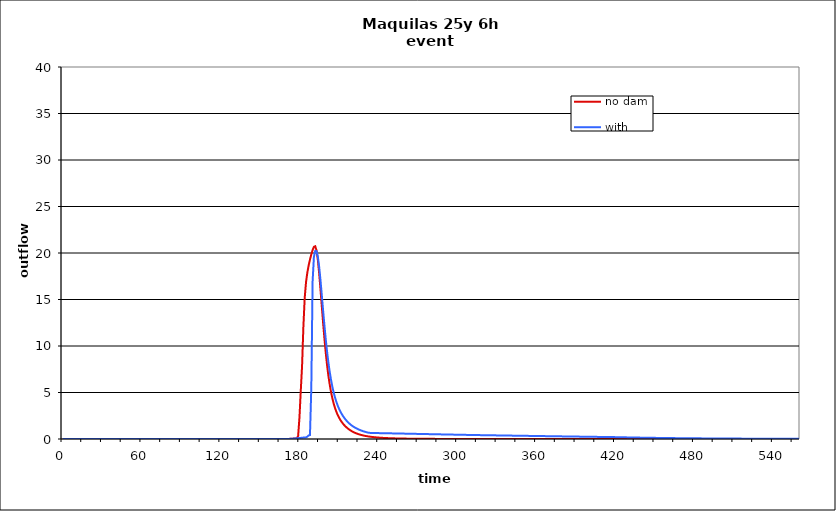
| Category | no dam | with dam |
|---|---|---|
| 0.0 | 0 | 0 |
| 1.0 | 0 | 0 |
| 2.0 | 0 | 0 |
| 3.0 | 0 | 0 |
| 4.0 | 0 | 0 |
| 5.0 | 0 | 0 |
| 6.0 | 0 | 0 |
| 7.0 | 0 | 0 |
| 8.0 | 0 | 0 |
| 9.0 | 0 | 0 |
| 10.0 | 0 | 0 |
| 11.0 | 0 | 0 |
| 12.0 | 0 | 0 |
| 13.0 | 0 | 0 |
| 14.0 | 0 | 0 |
| 15.0 | 0 | 0 |
| 16.0 | 0 | 0 |
| 17.0 | 0 | 0 |
| 18.0 | 0 | 0 |
| 19.0 | 0 | 0 |
| 20.0 | 0 | 0 |
| 21.0 | 0 | 0 |
| 22.0 | 0 | 0 |
| 23.0 | 0 | 0 |
| 24.0 | 0 | 0 |
| 25.0 | 0 | 0 |
| 26.0 | 0 | 0 |
| 27.0 | 0 | 0 |
| 28.0 | 0 | 0 |
| 29.0 | 0 | 0 |
| 30.0 | 0 | 0 |
| 31.0 | 0 | 0 |
| 32.0 | 0 | 0 |
| 33.0 | 0 | 0 |
| 34.0 | 0 | 0 |
| 35.0 | 0 | 0 |
| 36.0 | 0 | 0 |
| 37.0 | 0 | 0 |
| 38.0 | 0 | 0 |
| 39.0 | 0 | 0 |
| 40.0 | 0 | 0 |
| 41.0 | 0 | 0 |
| 42.0 | 0 | 0 |
| 43.0 | 0 | 0 |
| 44.0 | 0 | 0 |
| 45.0 | 0 | 0 |
| 46.0 | 0 | 0 |
| 47.0 | 0 | 0 |
| 48.0 | 0 | 0 |
| 49.0 | 0 | 0 |
| 50.0 | 0 | 0 |
| 51.0 | 0 | 0 |
| 52.0 | 0 | 0 |
| 53.0 | 0 | 0 |
| 54.0 | 0 | 0 |
| 55.0 | 0 | 0 |
| 56.0 | 0 | 0 |
| 57.0 | 0 | 0 |
| 58.0 | 0 | 0 |
| 59.0 | 0 | 0 |
| 60.0 | 0 | 0 |
| 61.0 | 0 | 0 |
| 62.0 | 0 | 0 |
| 63.0 | 0 | 0 |
| 64.0 | 0 | 0 |
| 65.0 | 0 | 0 |
| 66.0 | 0 | 0 |
| 67.0 | 0 | 0 |
| 68.0 | 0 | 0 |
| 69.0 | 0 | 0 |
| 70.0 | 0 | 0 |
| 71.0 | 0 | 0 |
| 72.0 | 0 | 0 |
| 73.0 | 0 | 0 |
| 74.0 | 0 | 0 |
| 75.0 | 0 | 0 |
| 76.0 | 0 | 0 |
| 77.0 | 0 | 0 |
| 78.0 | 0 | 0 |
| 79.0 | 0 | 0 |
| 80.0 | 0 | 0 |
| 81.0 | 0 | 0 |
| 82.0 | 0 | 0 |
| 83.0 | 0 | 0 |
| 84.0 | 0 | 0 |
| 85.0 | 0 | 0 |
| 86.0 | 0 | 0 |
| 87.0 | 0 | 0 |
| 88.0 | 0 | 0 |
| 89.0 | 0 | 0 |
| 90.0 | 0 | 0 |
| 91.0 | 0 | 0 |
| 92.0 | 0 | 0 |
| 93.0 | 0 | 0 |
| 94.0 | 0 | 0 |
| 95.0 | 0 | 0 |
| 96.0 | 0 | 0 |
| 97.0 | 0 | 0 |
| 98.0 | 0 | 0 |
| 99.0 | 0 | 0 |
| 100.0 | 0 | 0 |
| 101.0 | 0 | 0 |
| 102.0 | 0 | 0 |
| 103.0 | 0 | 0 |
| 104.0 | 0 | 0 |
| 105.0 | 0 | 0 |
| 106.0 | 0 | 0 |
| 107.0 | 0 | 0 |
| 108.0 | 0 | 0 |
| 109.0 | 0 | 0 |
| 110.0 | 0 | 0 |
| 111.0 | 0 | 0 |
| 112.0 | 0 | 0 |
| 113.0 | 0 | 0 |
| 114.0 | 0 | 0 |
| 115.0 | 0 | 0 |
| 116.0 | 0 | 0 |
| 117.0 | 0 | 0 |
| 118.0 | 0 | 0 |
| 119.0 | 0 | 0 |
| 120.0 | 0 | 0 |
| 121.0 | 0 | 0 |
| 122.0 | 0 | 0 |
| 123.0 | 0 | 0 |
| 124.0 | 0 | 0 |
| 125.0 | 0 | 0 |
| 126.0 | 0 | 0 |
| 127.0 | 0 | 0 |
| 128.0 | 0 | 0 |
| 129.0 | 0 | 0 |
| 130.0 | 0 | 0 |
| 131.0 | 0 | 0 |
| 132.0 | 0 | 0 |
| 133.0 | 0 | 0 |
| 134.0 | 0 | 0 |
| 135.0 | 0 | 0 |
| 136.0 | 0 | 0 |
| 137.0 | 0 | 0 |
| 138.0 | 0 | 0 |
| 139.0 | 0 | 0 |
| 140.0 | 0 | 0 |
| 141.0 | 0 | 0 |
| 142.0 | 0 | 0 |
| 143.0 | 0 | 0 |
| 144.0 | 0 | 0 |
| 145.0 | 0 | 0 |
| 146.0 | 0 | 0 |
| 147.0 | 0 | 0 |
| 148.0 | 0 | 0 |
| 149.0 | 0 | 0 |
| 150.0 | 0 | 0 |
| 151.0 | 0 | 0 |
| 152.0 | 0 | 0 |
| 153.0 | 0 | 0 |
| 154.0 | 0 | 0 |
| 155.0 | 0 | 0 |
| 156.0 | 0 | 0 |
| 157.0 | 0 | 0 |
| 158.0 | 0 | 0 |
| 159.0 | 0 | 0 |
| 160.0 | 0 | 0 |
| 161.0 | 0 | 0 |
| 162.0 | 0 | 0 |
| 163.0 | 0 | 0 |
| 164.0 | 0 | 0 |
| 165.0 | 0 | 0 |
| 166.0 | 0.001 | 0.001 |
| 167.0 | 0.001 | 0.001 |
| 168.0 | 0.001 | 0.001 |
| 169.0 | 0.001 | 0.001 |
| 170.0 | 0.002 | 0.002 |
| 171.0 | 0.003 | 0.003 |
| 172.0 | 0.009 | 0.009 |
| 173.0 | 0.018 | 0.018 |
| 174.0 | 0.029 | 0.028 |
| 175.0 | 0.04 | 0.039 |
| 176.0 | 0.052 | 0.051 |
| 177.0 | 0.059 | 0.063 |
| 178.0 | 0.091 | 0.077 |
| 179.0 | 0.318 | 0.091 |
| 180.0 | 2.296 | 0.105 |
| 181.0 | 5.169 | 0.121 |
| 182.0 | 7.875 | 0.136 |
| 183.0 | 12.093 | 0.152 |
| 184.0 | 15.18 | 0.164 |
| 185.0 | 16.865 | 0.177 |
| 186.0 | 17.899 | 0.255 |
| 187.0 | 18.661 | 0.38 |
| 188.0 | 19.294 | 0.425 |
| 189.0 | 19.843 | 5.418 |
| 190.0 | 20.314 | 16.945 |
| 191.0 | 20.663 | 19.592 |
| 192.0 | 20.724 | 20.225 |
| 193.0 | 20.264 | 20.198 |
| 194.0 | 19.236 | 19.599 |
| 195.0 | 17.79 | 18.495 |
| 196.0 | 16.079 | 17.058 |
| 197.0 | 14.263 | 15.443 |
| 198.0 | 12.468 | 13.79 |
| 199.0 | 10.779 | 12.192 |
| 200.0 | 9.258 | 10.71 |
| 201.0 | 7.933 | 9.384 |
| 202.0 | 6.802 | 8.224 |
| 203.0 | 5.854 | 7.22 |
| 204.0 | 5.056 | 6.363 |
| 205.0 | 4.382 | 5.634 |
| 206.0 | 3.816 | 5.01 |
| 207.0 | 3.345 | 4.476 |
| 208.0 | 2.949 | 4.017 |
| 209.0 | 2.612 | 3.624 |
| 210.0 | 2.323 | 3.283 |
| 211.0 | 2.073 | 2.986 |
| 212.0 | 1.856 | 2.724 |
| 213.0 | 1.666 | 2.493 |
| 214.0 | 1.497 | 2.287 |
| 215.0 | 1.352 | 2.103 |
| 216.0 | 1.223 | 1.939 |
| 217.0 | 1.106 | 1.791 |
| 218.0 | 1.001 | 1.657 |
| 219.0 | 0.906 | 1.535 |
| 220.0 | 0.822 | 1.427 |
| 221.0 | 0.747 | 1.331 |
| 222.0 | 0.68 | 1.245 |
| 223.0 | 0.619 | 1.166 |
| 224.0 | 0.565 | 1.093 |
| 225.0 | 0.516 | 1.027 |
| 226.0 | 0.472 | 0.966 |
| 227.0 | 0.432 | 0.911 |
| 228.0 | 0.396 | 0.86 |
| 229.0 | 0.364 | 0.812 |
| 230.0 | 0.334 | 0.769 |
| 231.0 | 0.308 | 0.729 |
| 232.0 | 0.284 | 0.694 |
| 233.0 | 0.262 | 0.667 |
| 234.0 | 0.242 | 0.653 |
| 235.0 | 0.224 | 0.647 |
| 236.0 | 0.208 | 0.644 |
| 237.0 | 0.193 | 0.641 |
| 238.0 | 0.179 | 0.638 |
| 239.0 | 0.166 | 0.636 |
| 240.0 | 0.155 | 0.633 |
| 241.0 | 0.144 | 0.631 |
| 242.0 | 0.134 | 0.628 |
| 243.0 | 0.125 | 0.625 |
| 244.0 | 0.117 | 0.623 |
| 245.0 | 0.109 | 0.62 |
| 246.0 | 0.102 | 0.617 |
| 247.0 | 0.096 | 0.614 |
| 248.0 | 0.089 | 0.612 |
| 249.0 | 0.084 | 0.609 |
| 250.0 | 0.079 | 0.606 |
| 251.0 | 0.074 | 0.603 |
| 252.0 | 0.069 | 0.6 |
| 253.0 | 0.065 | 0.597 |
| 254.0 | 0.061 | 0.595 |
| 255.0 | 0.058 | 0.592 |
| 256.0 | 0.054 | 0.589 |
| 257.0 | 0.051 | 0.586 |
| 258.0 | 0.048 | 0.583 |
| 259.0 | 0.046 | 0.58 |
| 260.0 | 0.043 | 0.577 |
| 261.0 | 0.041 | 0.574 |
| 262.0 | 0.039 | 0.571 |
| 263.0 | 0.036 | 0.568 |
| 264.0 | 0.035 | 0.566 |
| 265.0 | 0.033 | 0.563 |
| 266.0 | 0.031 | 0.56 |
| 267.0 | 0.029 | 0.557 |
| 268.0 | 0.028 | 0.554 |
| 269.0 | 0.026 | 0.551 |
| 270.0 | 0.025 | 0.548 |
| 271.0 | 0.024 | 0.545 |
| 272.0 | 0.023 | 0.542 |
| 273.0 | 0.022 | 0.539 |
| 274.0 | 0.02 | 0.536 |
| 275.0 | 0.019 | 0.534 |
| 276.0 | 0.019 | 0.531 |
| 277.0 | 0.018 | 0.528 |
| 278.0 | 0.017 | 0.525 |
| 279.0 | 0.016 | 0.522 |
| 280.0 | 0.015 | 0.519 |
| 281.0 | 0.014 | 0.516 |
| 282.0 | 0.014 | 0.513 |
| 283.0 | 0.013 | 0.51 |
| 284.0 | 0.013 | 0.507 |
| 285.0 | 0.012 | 0.505 |
| 286.0 | 0.011 | 0.502 |
| 287.0 | 0.011 | 0.499 |
| 288.0 | 0.01 | 0.496 |
| 289.0 | 0.01 | 0.493 |
| 290.0 | 0.009 | 0.49 |
| 291.0 | 0.009 | 0.488 |
| 292.0 | 0.008 | 0.485 |
| 293.0 | 0.008 | 0.482 |
| 294.0 | 0.007 | 0.479 |
| 295.0 | 0.007 | 0.476 |
| 296.0 | 0.007 | 0.473 |
| 297.0 | 0.006 | 0.471 |
| 298.0 | 0.006 | 0.468 |
| 299.0 | 0.005 | 0.465 |
| 300.0 | 0.005 | 0.462 |
| 301.0 | 0.005 | 0.46 |
| 302.0 | 0.004 | 0.457 |
| 303.0 | 0.004 | 0.454 |
| 304.0 | 0.004 | 0.451 |
| 305.0 | 0.003 | 0.449 |
| 306.0 | 0.003 | 0.446 |
| 307.0 | 0.003 | 0.443 |
| 308.0 | 0.003 | 0.44 |
| 309.0 | 0.002 | 0.438 |
| 310.0 | 0.002 | 0.435 |
| 311.0 | 0.002 | 0.432 |
| 312.0 | 0.002 | 0.43 |
| 313.0 | 0.001 | 0.427 |
| 314.0 | 0.001 | 0.424 |
| 315.0 | 0.001 | 0.422 |
| 316.0 | 0.001 | 0.42 |
| 317.0 | 0.001 | 0.417 |
| 318.0 | 0.001 | 0.415 |
| 319.0 | 0.001 | 0.413 |
| 320.0 | 0.001 | 0.411 |
| 321.0 | 0.001 | 0.408 |
| 322.0 | 0.001 | 0.406 |
| 323.0 | 0 | 0.404 |
| 324.0 | 0 | 0.402 |
| 325.0 | 0 | 0.4 |
| 326.0 | 0 | 0.397 |
| 327.0 | 0 | 0.395 |
| 328.0 | 0 | 0.393 |
| 329.0 | 0 | 0.391 |
| 330.0 | 0 | 0.388 |
| 331.0 | 0 | 0.386 |
| 332.0 | 0 | 0.384 |
| 333.0 | 0 | 0.382 |
| 334.0 | 0 | 0.38 |
| 335.0 | 0 | 0.377 |
| 336.0 | 0 | 0.375 |
| 337.0 | 0 | 0.373 |
| 338.0 | 0 | 0.371 |
| 339.0 | 0 | 0.369 |
| 340.0 | 0 | 0.366 |
| 341.0 | 0 | 0.364 |
| 342.0 | 0 | 0.362 |
| 343.0 | 0 | 0.36 |
| 344.0 | 0 | 0.358 |
| 345.0 | 0 | 0.355 |
| 346.0 | 0 | 0.353 |
| 347.0 | 0 | 0.351 |
| 348.0 | 0 | 0.349 |
| 349.0 | 0 | 0.347 |
| 350.0 | 0 | 0.345 |
| 351.0 | 0 | 0.342 |
| 352.0 | 0 | 0.34 |
| 353.0 | 0 | 0.338 |
| 354.0 | 0 | 0.336 |
| 355.0 | 0 | 0.334 |
| 356.0 | 0 | 0.332 |
| 357.0 | 0 | 0.33 |
| 358.0 | 0 | 0.327 |
| 359.0 | 0 | 0.325 |
| 360.0 | 0 | 0.323 |
| 361.0 | 0 | 0.321 |
| 362.0 | 0 | 0.319 |
| 363.0 | 0 | 0.317 |
| 364.0 | 0 | 0.315 |
| 365.0 | 0 | 0.313 |
| 366.0 | 0 | 0.311 |
| 367.0 | 0 | 0.308 |
| 368.0 | 0 | 0.306 |
| 369.0 | 0 | 0.304 |
| 370.0 | 0 | 0.302 |
| 371.0 | 0 | 0.3 |
| 372.0 | 0 | 0.298 |
| 373.0 | 0 | 0.296 |
| 374.0 | 0 | 0.294 |
| 375.0 | 0 | 0.292 |
| 376.0 | 0 | 0.29 |
| 377.0 | 0 | 0.288 |
| 378.0 | 0 | 0.285 |
| 379.0 | 0 | 0.283 |
| 380.0 | 0 | 0.281 |
| 381.0 | 0 | 0.279 |
| 382.0 | 0 | 0.277 |
| 383.0 | 0 | 0.275 |
| 384.0 | 0 | 0.273 |
| 385.0 | 0 | 0.271 |
| 386.0 | 0 | 0.269 |
| 387.0 | 0 | 0.267 |
| 388.0 | 0 | 0.265 |
| 389.0 | 0 | 0.263 |
| 390.0 | 0 | 0.261 |
| 391.0 | 0 | 0.259 |
| 392.0 | 0 | 0.257 |
| 393.0 | 0 | 0.255 |
| 394.0 | 0 | 0.253 |
| 395.0 | 0 | 0.251 |
| 396.0 | 0 | 0.249 |
| 397.0 | 0 | 0.247 |
| 398.0 | 0 | 0.245 |
| 399.0 | 0 | 0.243 |
| 400.0 | 0 | 0.241 |
| 401.0 | 0 | 0.239 |
| 402.0 | 0 | 0.237 |
| 403.0 | 0 | 0.235 |
| 404.0 | 0 | 0.233 |
| 405.0 | 0 | 0.231 |
| 406.0 | 0 | 0.229 |
| 407.0 | 0 | 0.227 |
| 408.0 | 0 | 0.225 |
| 409.0 | 0 | 0.223 |
| 410.0 | 0 | 0.221 |
| 411.0 | 0 | 0.219 |
| 412.0 | 0 | 0.217 |
| 413.0 | 0 | 0.215 |
| 414.0 | 0 | 0.213 |
| 415.0 | 0 | 0.212 |
| 416.0 | 0 | 0.21 |
| 417.0 | 0 | 0.208 |
| 418.0 | 0 | 0.206 |
| 419.0 | 0 | 0.204 |
| 420.0 | 0 | 0.201 |
| 421.0 | 0 | 0.198 |
| 422.0 | 0 | 0.195 |
| 423.0 | 0 | 0.192 |
| 424.0 | 0 | 0.189 |
| 425.0 | 0 | 0.186 |
| 426.0 | 0 | 0.183 |
| 427.0 | 0 | 0.18 |
| 428.0 | 0 | 0.177 |
| 429.0 | 0 | 0.174 |
| 430.0 | 0 | 0.171 |
| 431.0 | 0 | 0.168 |
| 432.0 | 0 | 0.165 |
| 433.0 | 0 | 0.163 |
| 434.0 | 0 | 0.16 |
| 435.0 | 0 | 0.157 |
| 436.0 | 0 | 0.155 |
| 437.0 | 0 | 0.152 |
| 438.0 | 0 | 0.15 |
| 439.0 | 0 | 0.147 |
| 440.0 | 0 | 0.145 |
| 441.0 | 0 | 0.142 |
| 442.0 | 0 | 0.14 |
| 443.0 | 0 | 0.138 |
| 444.0 | 0 | 0.135 |
| 445.0 | 0 | 0.133 |
| 446.0 | 0 | 0.131 |
| 447.0 | 0 | 0.129 |
| 448.0 | 0 | 0.126 |
| 449.0 | 0 | 0.124 |
| 450.0 | 0 | 0.122 |
| 451.0 | 0 | 0.12 |
| 452.0 | 0 | 0.118 |
| 453.0 | 0 | 0.116 |
| 454.0 | 0 | 0.114 |
| 455.0 | 0 | 0.112 |
| 456.0 | 0 | 0.111 |
| 457.0 | 0 | 0.109 |
| 458.0 | 0 | 0.107 |
| 459.0 | 0 | 0.105 |
| 460.0 | 0 | 0.103 |
| 461.0 | 0 | 0.102 |
| 462.0 | 0 | 0.1 |
| 463.0 | 0 | 0.098 |
| 464.0 | 0 | 0.097 |
| 465.0 | 0 | 0.095 |
| 466.0 | 0 | 0.093 |
| 467.0 | 0 | 0.092 |
| 468.0 | 0 | 0.09 |
| 469.0 | 0 | 0.089 |
| 470.0 | 0 | 0.087 |
| 471.0 | 0 | 0.086 |
| 472.0 | 0 | 0.084 |
| 473.0 | 0 | 0.083 |
| 474.0 | 0 | 0.082 |
| 475.0 | 0 | 0.08 |
| 476.0 | 0 | 0.079 |
| 477.0 | 0 | 0.078 |
| 478.0 | 0 | 0.076 |
| 479.0 | 0 | 0.075 |
| 480.0 | 0 | 0.074 |
| 481.0 | 0 | 0.072 |
| 482.0 | 0 | 0.071 |
| 483.0 | 0 | 0.07 |
| 484.0 | 0 | 0.069 |
| 485.0 | 0 | 0.068 |
| 486.0 | 0 | 0.067 |
| 487.0 | 0 | 0.065 |
| 488.0 | 0 | 0.064 |
| 489.0 | 0 | 0.063 |
| 490.0 | 0 | 0.062 |
| 491.0 | 0 | 0.061 |
| 492.0 | 0 | 0.06 |
| 493.0 | 0 | 0.059 |
| 494.0 | 0 | 0.058 |
| 495.0 | 0 | 0.057 |
| 496.0 | 0 | 0.056 |
| 497.0 | 0 | 0.055 |
| 498.0 | 0 | 0.054 |
| 499.0 | 0 | 0.053 |
| 500.0 | 0 | 0.052 |
| 501.0 | 0 | 0.052 |
| 502.0 | 0 | 0.051 |
| 503.0 | 0 | 0.05 |
| 504.0 | 0 | 0.049 |
| 505.0 | 0 | 0.048 |
| 506.0 | 0 | 0.047 |
| 507.0 | 0 | 0.047 |
| 508.0 | 0 | 0.046 |
| 509.0 | 0 | 0.045 |
| 510.0 | 0 | 0.044 |
| 511.0 | 0 | 0.044 |
| 512.0 | 0 | 0.043 |
| 513.0 | 0 | 0.042 |
| 514.0 | 0 | 0.041 |
| 515.0 | 0 | 0.041 |
| 516.0 | 0 | 0.04 |
| 517.0 | 0 | 0.039 |
| 518.0 | 0 | 0.039 |
| 519.0 | 0 | 0.038 |
| 520.0 | 0 | 0.037 |
| 521.0 | 0 | 0.037 |
| 522.0 | 0 | 0.036 |
| 523.0 | 0 | 0.035 |
| 524.0 | 0 | 0.035 |
| 525.0 | 0 | 0.034 |
| 526.0 | 0 | 0.034 |
| 527.0 | 0 | 0.033 |
| 528.0 | 0 | 0.032 |
| 529.0 | 0 | 0.032 |
| 530.0 | 0 | 0.031 |
| 531.0 | 0 | 0.031 |
| 532.0 | 0 | 0.03 |
| 533.0 | 0 | 0.03 |
| 534.0 | 0 | 0.029 |
| 535.0 | 0 | 0.029 |
| 536.0 | 0 | 0.028 |
| 537.0 | 0 | 0.028 |
| 538.0 | 0 | 0.027 |
| 539.0 | 0 | 0.027 |
| 540.0 | 0 | 0.026 |
| 541.0 | 0 | 0.026 |
| 542.0 | 0 | 0.026 |
| 543.0 | 0 | 0.025 |
| 544.0 | 0 | 0.025 |
| 545.0 | 0 | 0.024 |
| 546.0 | 0 | 0.024 |
| 547.0 | 0 | 0.023 |
| 548.0 | 0 | 0.023 |
| 549.0 | 0 | 0.023 |
| 550.0 | 0 | 0.022 |
| 551.0 | 0 | 0.022 |
| 552.0 | 0 | 0.021 |
| 553.0 | 0 | 0.021 |
| 554.0 | 0 | 0.021 |
| 555.0 | 0 | 0.02 |
| 556.0 | 0 | 0.02 |
| 557.0 | 0 | 0.02 |
| 558.0 | 0 | 0.019 |
| 559.0 | 0 | 0.019 |
| 560.0 | 0 | 0.019 |